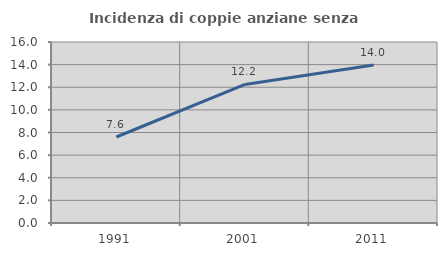
| Category | Incidenza di coppie anziane senza figli  |
|---|---|
| 1991.0 | 7.602 |
| 2001.0 | 12.245 |
| 2011.0 | 13.97 |